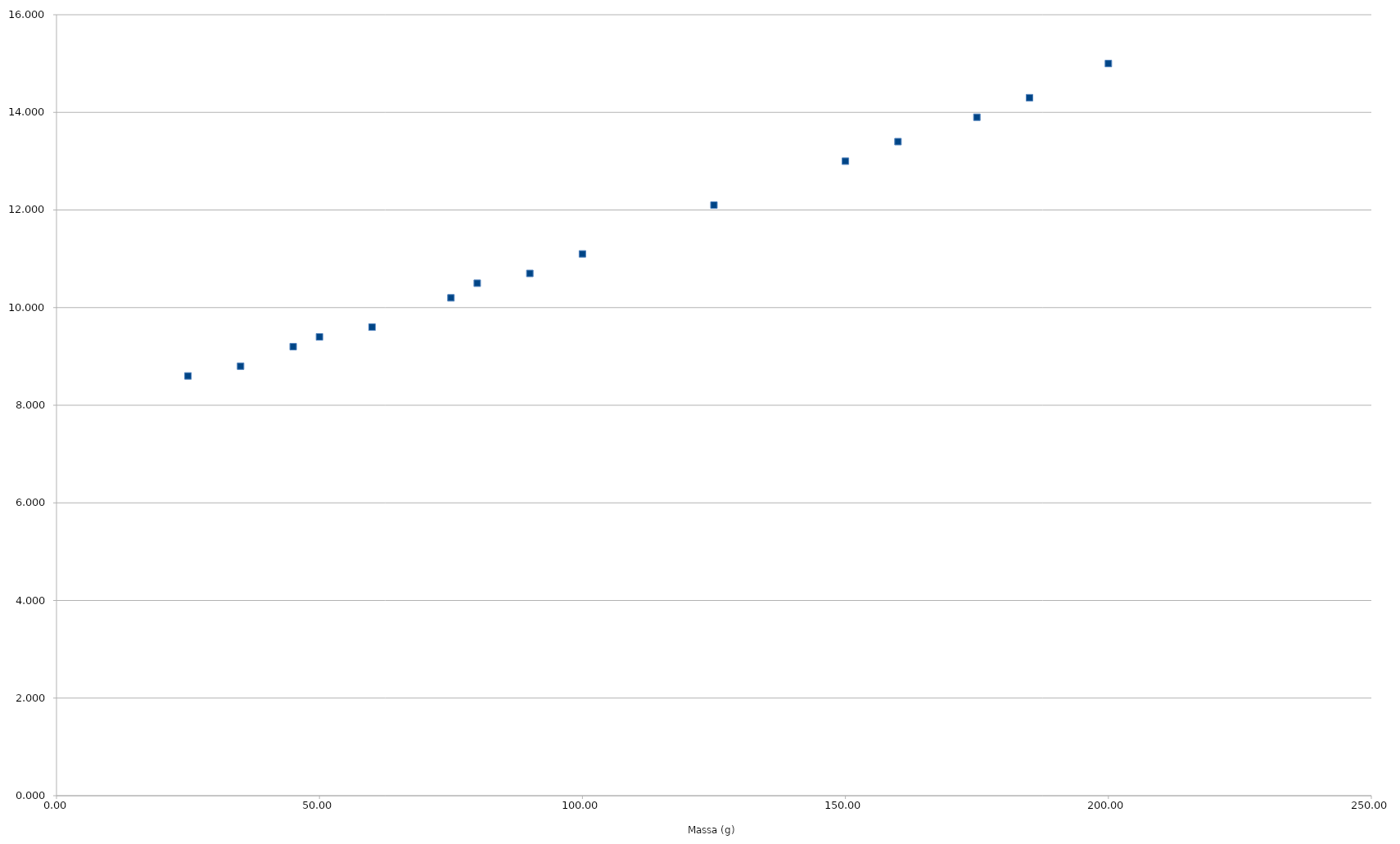
| Category | massa allungamento |
|---|---|
| 25.0 | 8.6 |
| 35.0 | 8.8 |
| 45.0 | 9.2 |
| 50.0 | 9.4 |
| 60.0 | 9.6 |
| 75.0 | 10.2 |
| 80.0 | 10.5 |
| 90.0 | 10.7 |
| 100.0 | 11.1 |
| 125.0 | 12.1 |
| 150.0 | 13 |
| 160.0 | 13.4 |
| 175.0 | 13.9 |
| 185.0 | 14.3 |
| 200.0 | 15 |